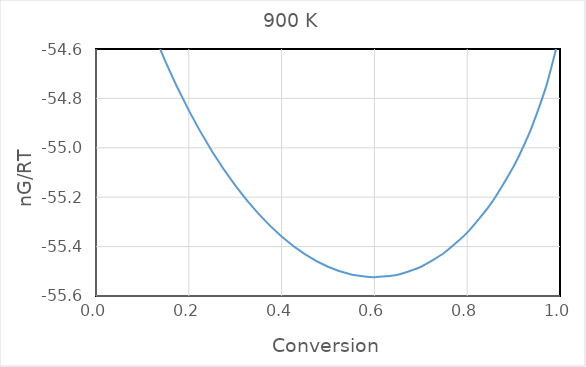
| Category | Series 0 |
|---|---|
| 0.05 | -54.121 |
| 0.1 | -54.415 |
| 0.15 | -54.652 |
| 0.2 | -54.848 |
| 0.25 | -55.014 |
| 0.3 | -55.152 |
| 0.35 | -55.266 |
| 0.4 | -55.359 |
| 0.45 | -55.43 |
| 0.5 | -55.481 |
| 0.55 | -55.513 |
| 0.6 | -55.524 |
| 0.65 | -55.514 |
| 0.7 | -55.482 |
| 0.75 | -55.426 |
| 0.8 | -55.343 |
| 0.85 | -55.229 |
| 0.9 | -55.075 |
| 0.92 | -54.999 |
| 0.94 | -54.912 |
| 0.97 | -54.752 |
| 0.99 | -54.611 |
| 0.995 | -54.566 |